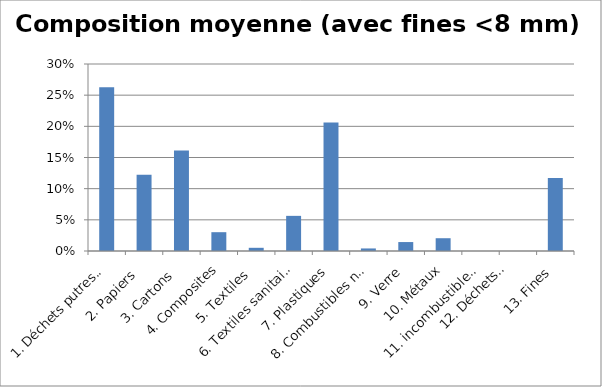
| Category | Composition moyenne (avec fines <8 mm) |
|---|---|
| 1. Déchets putrescibles | 0.263 |
| 2. Papiers  | 0.122 |
| 3. Cartons  | 0.161 |
| 4. Composites | 0.03 |
| 5. Textiles  | 0.005 |
| 6. Textiles sanitaires | 0.056 |
| 7. Plastiques | 0.206 |
| 8. Combustibles non classés | 0.004 |
| 9. Verre | 0.014 |
| 10. Métaux | 0.021 |
| 11. incombustibles non classés | 0 |
| 12. Déchets
 dangereux | 0 |
| 13. Fines | 0.117 |